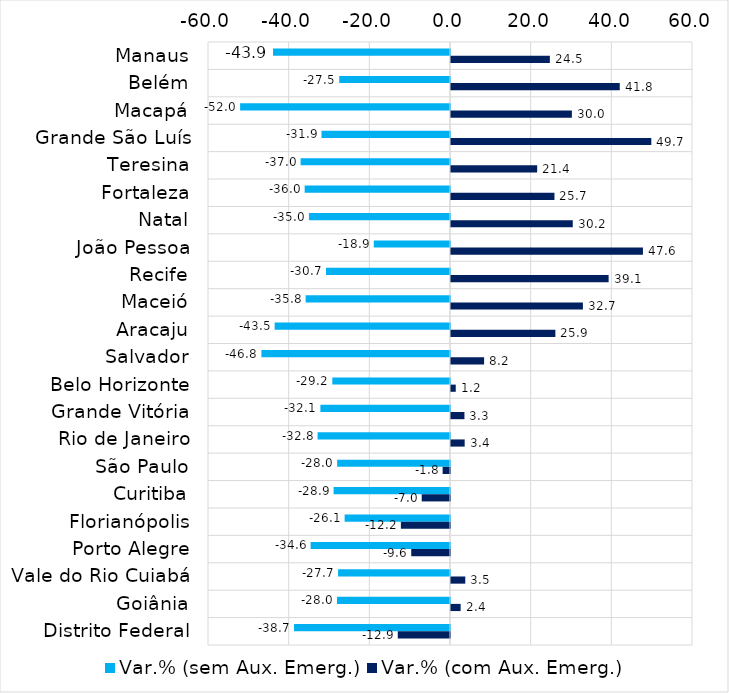
| Category | Var.% (sem Aux. Emerg.) | Var.% (com Aux. Emerg.) |
|---|---|---|
| Manaus | -43.876 | 24.51 |
| Belém | -27.461 | 41.842 |
| Macapá | -52.037 | 29.972 |
| Grande São Luís | -31.856 | 49.664 |
| Teresina | -37.038 | 21.364 |
| Fortaleza | -36.032 | 25.651 |
| Natal | -34.98 | 30.194 |
| João Pessoa | -18.9 | 47.589 |
| Recife | -30.745 | 39.08 |
| Maceió | -35.795 | 32.709 |
| Aracaju | -43.473 | 25.877 |
| Salvador | -46.757 | 8.204 |
| Belo Horizonte | -29.177 | 1.177 |
| Grande Vitória | -32.136 | 3.333 |
| Rio de Janeiro | -32.829 | 3.389 |
| São Paulo | -27.982 | -1.829 |
| Curitiba | -28.855 | -7.015 |
| Florianópolis | -26.128 | -12.183 |
| Porto Alegre | -34.553 | -9.614 |
| Vale do Rio Cuiabá | -27.75 | 3.54 |
| Goiânia | -28.027 | 2.389 |
| Distrito Federal | -38.668 | -12.946 |